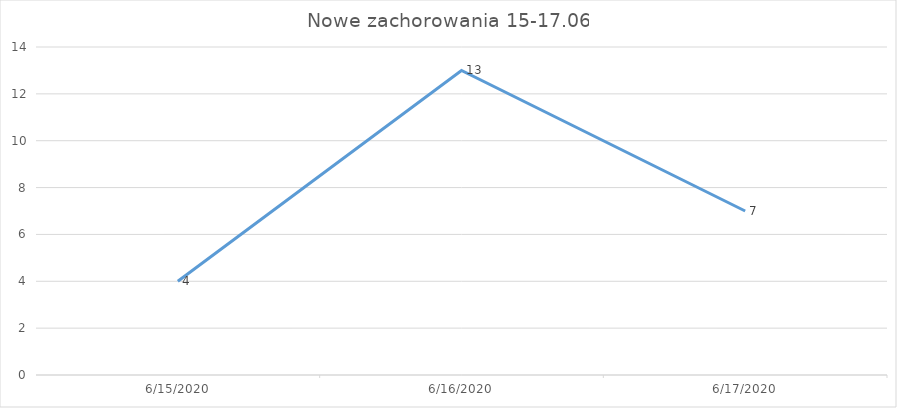
| Category | Series 0 |
|---|---|
| 6/15/20 | 4 |
| 6/16/20 | 13 |
| 6/17/20 | 7 |